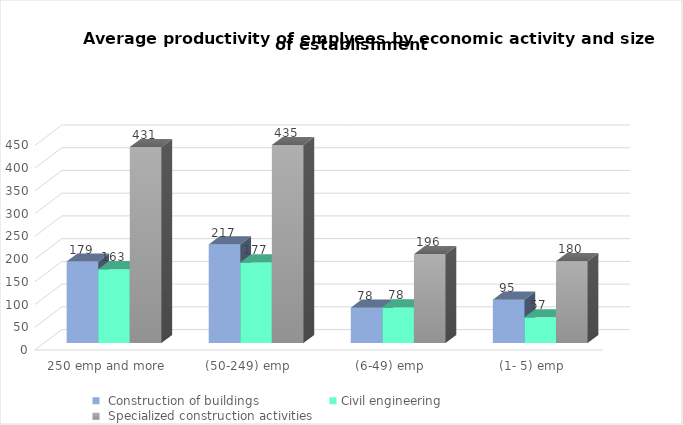
| Category |  Construction of buildings | Civil engineering |  Specialized construction activities |
|---|---|---|---|
|  (1- 5) emp  | 95.275 | 56.604 | 180.005 |
|  (6-49) emp  | 77.945 | 78.387 | 195.616 |
|  (50-249) emp  | 216.824 | 177.302 | 435.471 |
|  250 emp and more  | 179.327 | 162.509 | 431.195 |